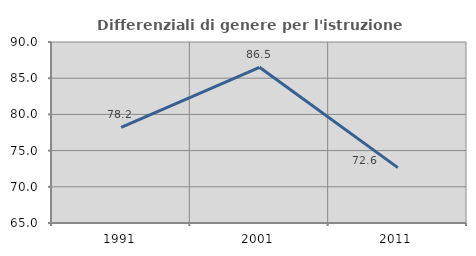
| Category | Differenziali di genere per l'istruzione superiore |
|---|---|
| 1991.0 | 78.202 |
| 2001.0 | 86.501 |
| 2011.0 | 72.644 |